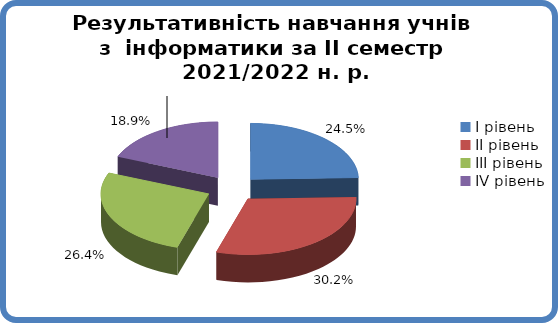
| Category | Series 0 |
|---|---|
| 0 | 0.245 |
| 1 | 0.302 |
| 2 | 0.264 |
| 3 | 0.189 |